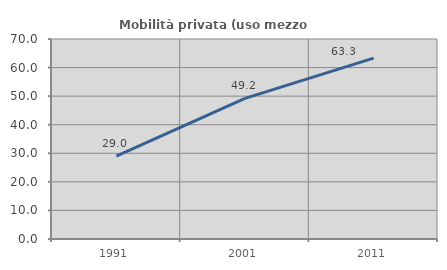
| Category | Mobilità privata (uso mezzo privato) |
|---|---|
| 1991.0 | 28.987 |
| 2001.0 | 49.233 |
| 2011.0 | 63.293 |